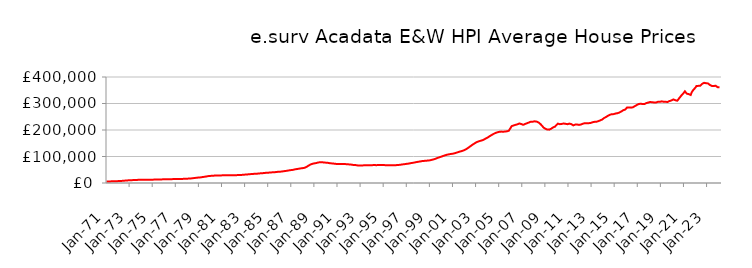
| Category | Series 0 |
|---|---|
| 1971-01-01 | 5853.436 |
| 1971-02-01 | 5895.031 |
| 1971-03-01 | 5936.975 |
| 1971-04-01 | 5991.508 |
| 1971-05-01 | 6082.004 |
| 1971-06-01 | 6176.308 |
| 1971-07-01 | 6292.273 |
| 1971-08-01 | 6418.457 |
| 1971-09-01 | 6543.633 |
| 1971-10-01 | 6673.679 |
| 1971-11-01 | 6814.065 |
| 1971-12-01 | 6985.009 |
| 1972-01-01 | 7103.659 |
| 1972-02-01 | 7181.341 |
| 1972-03-01 | 7358.166 |
| 1972-04-01 | 7605.43 |
| 1972-05-01 | 7962.692 |
| 1972-06-01 | 8276.193 |
| 1972-07-01 | 8636.637 |
| 1972-08-01 | 8984.344 |
| 1972-09-01 | 9291.366 |
| 1972-10-01 | 9578.299 |
| 1972-11-01 | 9843.997 |
| 1972-12-01 | 10118.095 |
| 1973-01-01 | 10314.181 |
| 1973-02-01 | 10452.731 |
| 1973-03-01 | 10612.008 |
| 1973-04-01 | 10793.69 |
| 1973-05-01 | 11026.628 |
| 1973-06-01 | 11177.969 |
| 1973-07-01 | 11336.47 |
| 1973-08-01 | 11512.298 |
| 1973-09-01 | 11717.491 |
| 1973-10-01 | 11930.237 |
| 1973-11-01 | 12092.365 |
| 1973-12-01 | 12208.625 |
| 1974-01-01 | 12270.98 |
| 1974-02-01 | 12338.184 |
| 1974-03-01 | 12335.431 |
| 1974-04-01 | 12308.804 |
| 1974-05-01 | 12285.307 |
| 1974-06-01 | 12286.162 |
| 1974-07-01 | 12298.11 |
| 1974-08-01 | 12338.216 |
| 1974-09-01 | 12411.174 |
| 1974-10-01 | 12500.791 |
| 1974-11-01 | 12575.059 |
| 1974-12-01 | 12648.38 |
| 1975-01-01 | 12682.302 |
| 1975-02-01 | 12725.093 |
| 1975-03-01 | 12801.036 |
| 1975-04-01 | 12909.172 |
| 1975-05-01 | 13040.454 |
| 1975-06-01 | 13110.738 |
| 1975-07-01 | 13179.658 |
| 1975-08-01 | 13274.816 |
| 1975-09-01 | 13403.597 |
| 1975-10-01 | 13546.676 |
| 1975-11-01 | 13672.653 |
| 1975-12-01 | 13807.382 |
| 1976-01-01 | 13902.24 |
| 1976-02-01 | 13991.571 |
| 1976-03-01 | 14052.695 |
| 1976-04-01 | 14117.71 |
| 1976-05-01 | 14202.771 |
| 1976-06-01 | 14258.424 |
| 1976-07-01 | 14319.985 |
| 1976-08-01 | 14411.092 |
| 1976-09-01 | 14541.477 |
| 1976-10-01 | 14688.422 |
| 1976-11-01 | 14806.001 |
| 1976-12-01 | 14911.001 |
| 1977-01-01 | 14969.384 |
| 1977-02-01 | 15036.434 |
| 1977-03-01 | 15079.911 |
| 1977-04-01 | 15130.906 |
| 1977-05-01 | 15209.671 |
| 1977-06-01 | 15281.094 |
| 1977-07-01 | 15368.912 |
| 1977-08-01 | 15489.355 |
| 1977-09-01 | 15636.651 |
| 1977-10-01 | 15802.58 |
| 1977-11-01 | 15978.12 |
| 1977-12-01 | 16207.246 |
| 1978-01-01 | 16377.397 |
| 1978-02-01 | 16510.197 |
| 1978-03-01 | 16689.159 |
| 1978-04-01 | 16929.906 |
| 1978-05-01 | 17315.852 |
| 1978-06-01 | 17706.408 |
| 1978-07-01 | 18178.766 |
| 1978-08-01 | 18663.278 |
| 1978-09-01 | 19129.575 |
| 1978-10-01 | 19593.243 |
| 1978-11-01 | 20025.608 |
| 1978-12-01 | 20452.811 |
| 1979-01-01 | 20706.935 |
| 1979-02-01 | 20877.381 |
| 1979-03-01 | 21301.955 |
| 1979-04-01 | 21883.938 |
| 1979-05-01 | 22626.635 |
| 1979-06-01 | 23097.945 |
| 1979-07-01 | 23587.133 |
| 1979-08-01 | 24138.002 |
| 1979-09-01 | 24797.971 |
| 1979-10-01 | 25502.455 |
| 1979-11-01 | 26089.013 |
| 1979-12-01 | 26544.775 |
| 1980-01-01 | 26794.997 |
| 1980-02-01 | 26989.487 |
| 1980-03-01 | 27239.034 |
| 1980-04-01 | 27531.237 |
| 1980-05-01 | 27873.047 |
| 1980-06-01 | 28055.891 |
| 1980-07-01 | 28221.691 |
| 1980-08-01 | 28374.915 |
| 1980-09-01 | 28482.952 |
| 1980-10-01 | 28552.136 |
| 1980-11-01 | 28605.31 |
| 1980-12-01 | 28718.435 |
| 1981-01-01 | 28785.682 |
| 1981-02-01 | 28887.694 |
| 1981-03-01 | 28989.981 |
| 1981-04-01 | 29127.268 |
| 1981-05-01 | 29266.461 |
| 1981-06-01 | 29313.685 |
| 1981-07-01 | 29336.206 |
| 1981-08-01 | 29341.771 |
| 1981-09-01 | 29286.506 |
| 1981-10-01 | 29185.652 |
| 1981-11-01 | 29093.062 |
| 1981-12-01 | 29082.983 |
| 1982-01-01 | 29038.044 |
| 1982-02-01 | 29057.726 |
| 1982-03-01 | 29218.871 |
| 1982-04-01 | 29490.37 |
| 1982-05-01 | 29794.494 |
| 1982-06-01 | 29905.477 |
| 1982-07-01 | 29989.212 |
| 1982-08-01 | 30148.889 |
| 1982-09-01 | 30407.805 |
| 1982-10-01 | 30715.418 |
| 1982-11-01 | 31021.884 |
| 1982-12-01 | 31401.945 |
| 1983-01-01 | 31690.741 |
| 1983-02-01 | 31938.939 |
| 1983-03-01 | 32197.556 |
| 1983-04-01 | 32518.055 |
| 1983-05-01 | 32938.406 |
| 1983-06-01 | 33268.275 |
| 1983-07-01 | 33627.445 |
| 1983-08-01 | 33968.673 |
| 1983-09-01 | 34241.441 |
| 1983-10-01 | 34464.598 |
| 1983-11-01 | 34675.18 |
| 1983-12-01 | 34951.755 |
| 1984-01-01 | 35117.057 |
| 1984-02-01 | 35284.885 |
| 1984-03-01 | 35603.527 |
| 1984-04-01 | 36045.544 |
| 1984-05-01 | 36551.527 |
| 1984-06-01 | 36775.858 |
| 1984-07-01 | 36963.603 |
| 1984-08-01 | 37249.651 |
| 1984-09-01 | 37706.107 |
| 1984-10-01 | 38234.212 |
| 1984-11-01 | 38642.374 |
| 1984-12-01 | 38926.049 |
| 1985-01-01 | 39004.795 |
| 1985-02-01 | 39113.625 |
| 1985-03-01 | 39381.177 |
| 1985-04-01 | 39756.986 |
| 1985-05-01 | 40186.096 |
| 1985-06-01 | 40351.922 |
| 1985-07-01 | 40505.228 |
| 1985-08-01 | 40770.985 |
| 1985-09-01 | 41214.195 |
| 1985-10-01 | 41720.373 |
| 1985-11-01 | 42145.809 |
| 1985-12-01 | 42486.07 |
| 1986-01-01 | 42618.326 |
| 1986-02-01 | 42753.366 |
| 1986-03-01 | 43147.821 |
| 1986-04-01 | 43718.413 |
| 1986-05-01 | 44430.577 |
| 1986-06-01 | 44861.736 |
| 1986-07-01 | 45302.5 |
| 1986-08-01 | 45828.669 |
| 1986-09-01 | 46489.999 |
| 1986-10-01 | 47204.193 |
| 1986-11-01 | 47852.471 |
| 1986-12-01 | 48456.903 |
| 1987-01-01 | 48807.58 |
| 1987-02-01 | 49097.942 |
| 1987-03-01 | 49727.772 |
| 1987-04-01 | 50575.776 |
| 1987-05-01 | 51589.003 |
| 1987-06-01 | 52160.728 |
| 1987-07-01 | 52707.671 |
| 1987-08-01 | 53309.593 |
| 1987-09-01 | 53962.968 |
| 1987-10-01 | 54639.331 |
| 1987-11-01 | 55273.021 |
| 1987-12-01 | 55929.402 |
| 1988-01-01 | 56241.432 |
| 1988-02-01 | 56510.544 |
| 1988-03-01 | 57451.77 |
| 1988-04-01 | 58868.244 |
| 1988-05-01 | 60999.522 |
| 1988-06-01 | 63150.157 |
| 1988-07-01 | 65682.48 |
| 1988-08-01 | 68011.909 |
| 1988-09-01 | 69805.564 |
| 1988-10-01 | 71294.816 |
| 1988-11-01 | 72492.564 |
| 1988-12-01 | 73555.984 |
| 1989-01-01 | 74111.867 |
| 1989-02-01 | 74581.813 |
| 1989-03-01 | 75379.46 |
| 1989-04-01 | 76395.013 |
| 1989-05-01 | 77470.912 |
| 1989-06-01 | 77940.993 |
| 1989-07-01 | 78261.046 |
| 1989-08-01 | 78411.096 |
| 1989-09-01 | 78281.736 |
| 1989-10-01 | 77919.751 |
| 1989-11-01 | 77438.186 |
| 1989-12-01 | 77045.683 |
| 1990-01-01 | 76692.421 |
| 1990-02-01 | 76677.925 |
| 1990-03-01 | 76151.559 |
| 1990-04-01 | 75468.388 |
| 1990-05-01 | 74669.578 |
| 1990-06-01 | 74288.399 |
| 1990-07-01 | 73963.585 |
| 1990-08-01 | 73646.982 |
| 1990-09-01 | 73202.082 |
| 1990-10-01 | 72693.558 |
| 1990-11-01 | 72221.602 |
| 1990-12-01 | 72021.119 |
| 1991-01-01 | 71880.186 |
| 1991-02-01 | 71955.707 |
| 1991-03-01 | 71841.309 |
| 1991-04-01 | 71765.739 |
| 1991-05-01 | 71666.273 |
| 1991-06-01 | 71621.76 |
| 1991-07-01 | 71574.462 |
| 1991-08-01 | 71508.11 |
| 1991-09-01 | 71394.539 |
| 1991-10-01 | 71191.381 |
| 1991-11-01 | 70858.624 |
| 1991-12-01 | 70506.688 |
| 1992-01-01 | 70158.125 |
| 1992-02-01 | 70104.673 |
| 1992-03-01 | 69615.741 |
| 1992-04-01 | 69025.587 |
| 1992-05-01 | 68374.133 |
| 1992-06-01 | 68160.886 |
| 1992-07-01 | 68007.563 |
| 1992-08-01 | 67685.786 |
| 1992-09-01 | 66998.998 |
| 1992-10-01 | 66146.836 |
| 1992-11-01 | 65569.169 |
| 1992-12-01 | 65585.984 |
| 1993-01-01 | 65748.247 |
| 1993-02-01 | 66035.391 |
| 1993-03-01 | 66293.403 |
| 1993-04-01 | 66616.18 |
| 1993-05-01 | 66891.369 |
| 1993-06-01 | 66922.848 |
| 1993-07-01 | 66942.759 |
| 1993-08-01 | 66997.878 |
| 1993-09-01 | 66955.948 |
| 1993-10-01 | 66835.303 |
| 1993-11-01 | 66756.355 |
| 1993-12-01 | 66990.052 |
| 1994-01-01 | 67311.536 |
| 1994-02-01 | 67712.307 |
| 1994-03-01 | 67697.03 |
| 1994-04-01 | 67533.624 |
| 1994-05-01 | 67390.12 |
| 1994-06-01 | 67402.982 |
| 1994-07-01 | 67483.973 |
| 1994-08-01 | 67650.551 |
| 1994-09-01 | 67915.323 |
| 1994-10-01 | 68236.094 |
| 1994-11-01 | 68387.906 |
| 1994-12-01 | 68298.345 |
| 1995-01-01 | 67797.893 |
| 1995-02-01 | 67367.093 |
| 1995-03-01 | 67205.11 |
| 1995-04-01 | 67036.325 |
| 1995-05-01 | 67064.918 |
| 1995-06-01 | 66922.64 |
| 1995-07-01 | 67068.521 |
| 1995-08-01 | 67133.315 |
| 1995-09-01 | 67171.629 |
| 1995-10-01 | 67147.551 |
| 1995-11-01 | 67232.22 |
| 1995-12-01 | 67314.701 |
| 1996-01-01 | 67339.12 |
| 1996-02-01 | 67298.148 |
| 1996-03-01 | 67520.514 |
| 1996-04-01 | 67782.934 |
| 1996-05-01 | 68281.505 |
| 1996-06-01 | 68646.477 |
| 1996-07-01 | 69242.481 |
| 1996-08-01 | 69819.15 |
| 1996-09-01 | 70401.777 |
| 1996-10-01 | 70826.005 |
| 1996-11-01 | 71275.79 |
| 1996-12-01 | 71911.805 |
| 1997-01-01 | 72368.006 |
| 1997-02-01 | 72854.01 |
| 1997-03-01 | 73269.099 |
| 1997-04-01 | 73942.764 |
| 1997-05-01 | 74822.704 |
| 1997-06-01 | 75490.879 |
| 1997-07-01 | 75962.601 |
| 1997-08-01 | 76714.525 |
| 1997-09-01 | 77387.268 |
| 1997-10-01 | 78258.613 |
| 1997-11-01 | 78867.902 |
| 1997-12-01 | 79641.704 |
| 1998-01-01 | 80100.782 |
| 1998-02-01 | 80790.184 |
| 1998-03-01 | 81391.552 |
| 1998-04-01 | 82138.146 |
| 1998-05-01 | 82668.5 |
| 1998-06-01 | 82994.32 |
| 1998-07-01 | 83384.475 |
| 1998-08-01 | 83749.543 |
| 1998-09-01 | 84119.064 |
| 1998-10-01 | 84364.251 |
| 1998-11-01 | 84650.311 |
| 1998-12-01 | 84994.214 |
| 1999-01-01 | 85503.232 |
| 1999-02-01 | 86519.835 |
| 1999-03-01 | 87415.99 |
| 1999-04-01 | 88305.006 |
| 1999-05-01 | 89278.555 |
| 1999-06-01 | 90308.463 |
| 1999-07-01 | 91520.965 |
| 1999-08-01 | 93090.307 |
| 1999-09-01 | 94690.066 |
| 1999-10-01 | 96159.901 |
| 1999-11-01 | 97157.947 |
| 1999-12-01 | 98498.503 |
| 2000-01-01 | 99567.622 |
| 2000-02-01 | 100776.058 |
| 2000-03-01 | 102279.627 |
| 2000-04-01 | 103914.463 |
| 2000-05-01 | 104838.974 |
| 2000-06-01 | 105804.892 |
| 2000-07-01 | 106827.34 |
| 2000-08-01 | 107678.206 |
| 2000-09-01 | 108404.666 |
| 2000-10-01 | 109096.686 |
| 2000-11-01 | 109628.409 |
| 2000-12-01 | 110172.965 |
| 2001-01-01 | 110626.749 |
| 2001-02-01 | 111477.155 |
| 2001-03-01 | 112493.387 |
| 2001-04-01 | 113610.039 |
| 2001-05-01 | 114886.889 |
| 2001-06-01 | 115997.552 |
| 2001-07-01 | 117210.594 |
| 2001-08-01 | 118469.144 |
| 2001-09-01 | 119428.264 |
| 2001-10-01 | 120193.085 |
| 2001-11-01 | 121367.69 |
| 2001-12-01 | 122777.378 |
| 2002-01-01 | 124487.88 |
| 2002-02-01 | 126263.288 |
| 2002-03-01 | 128290.948 |
| 2002-04-01 | 130542.951 |
| 2002-05-01 | 132961.126 |
| 2002-06-01 | 135601.259 |
| 2002-07-01 | 138445.54 |
| 2002-08-01 | 141038.029 |
| 2002-09-01 | 143694.633 |
| 2002-10-01 | 146192.946 |
| 2002-11-01 | 148424.808 |
| 2002-12-01 | 150792.342 |
| 2003-01-01 | 152935.809 |
| 2003-02-01 | 154665.297 |
| 2003-03-01 | 156162.467 |
| 2003-04-01 | 157482.386 |
| 2003-05-01 | 158748.366 |
| 2003-06-01 | 159610.387 |
| 2003-07-01 | 160479.324 |
| 2003-08-01 | 161928.665 |
| 2003-09-01 | 163620.085 |
| 2003-10-01 | 165798.399 |
| 2003-11-01 | 167670.856 |
| 2003-12-01 | 169612.677 |
| 2004-01-01 | 171526.849 |
| 2004-02-01 | 173927.847 |
| 2004-03-01 | 176226.898 |
| 2004-04-01 | 178308.166 |
| 2004-05-01 | 180629.742 |
| 2004-06-01 | 182756.177 |
| 2004-07-01 | 184899.192 |
| 2004-08-01 | 186961.93 |
| 2004-09-01 | 188567.733 |
| 2004-10-01 | 190269.589 |
| 2004-11-01 | 191118.126 |
| 2004-12-01 | 192143.606 |
| 2005-01-01 | 192890.198 |
| 2005-02-01 | 194062.31 |
| 2005-03-01 | 193963.667 |
| 2005-04-01 | 194002.62 |
| 2005-05-01 | 193452.272 |
| 2005-06-01 | 194018.225 |
| 2005-07-01 | 194071.909 |
| 2005-08-01 | 194408.873 |
| 2005-09-01 | 195011.417 |
| 2005-10-01 | 196181.058 |
| 2005-11-01 | 197023.625 |
| 2005-12-01 | 202962.896 |
| 2006-01-01 | 208412.312 |
| 2006-02-01 | 214499.109 |
| 2006-03-01 | 215515.616 |
| 2006-04-01 | 217191.313 |
| 2006-05-01 | 218233.419 |
| 2006-06-01 | 219510.815 |
| 2006-07-01 | 219914.259 |
| 2006-08-01 | 221414.125 |
| 2006-09-01 | 223135.031 |
| 2006-10-01 | 224622.122 |
| 2006-11-01 | 225033.928 |
| 2006-12-01 | 222513.459 |
| 2007-01-01 | 220589.243 |
| 2007-02-01 | 219585.779 |
| 2007-03-01 | 220992.009 |
| 2007-04-01 | 222808.972 |
| 2007-05-01 | 223946.863 |
| 2007-06-01 | 225752.01 |
| 2007-07-01 | 226550.853 |
| 2007-08-01 | 228414.553 |
| 2007-09-01 | 230104.064 |
| 2007-10-01 | 231450.555 |
| 2007-11-01 | 231179.876 |
| 2007-12-01 | 231433.737 |
| 2008-01-01 | 231862.829 |
| 2008-02-01 | 232777.92 |
| 2008-03-01 | 232177.934 |
| 2008-04-01 | 231593.431 |
| 2008-05-01 | 230034.299 |
| 2008-06-01 | 228228.769 |
| 2008-07-01 | 225035.701 |
| 2008-08-01 | 222117.145 |
| 2008-09-01 | 218352.898 |
| 2008-10-01 | 214227.176 |
| 2008-11-01 | 209529.519 |
| 2008-12-01 | 206241.589 |
| 2009-01-01 | 204766.945 |
| 2009-02-01 | 203425.693 |
| 2009-03-01 | 201733.2 |
| 2009-04-01 | 200864.309 |
| 2009-05-01 | 201377.137 |
| 2009-06-01 | 202903.735 |
| 2009-07-01 | 204635.206 |
| 2009-08-01 | 206997.509 |
| 2009-09-01 | 209709.561 |
| 2009-10-01 | 212208.729 |
| 2009-11-01 | 212654.967 |
| 2009-12-01 | 217045.418 |
| 2010-01-01 | 220328.658 |
| 2010-02-01 | 224087.725 |
| 2010-03-01 | 222679.125 |
| 2010-04-01 | 221932.015 |
| 2010-05-01 | 222126.787 |
| 2010-06-01 | 222964.404 |
| 2010-07-01 | 223710.277 |
| 2010-08-01 | 224451.864 |
| 2010-09-01 | 224267.605 |
| 2010-10-01 | 223377.258 |
| 2010-11-01 | 221777.534 |
| 2010-12-01 | 221917.443 |
| 2011-01-01 | 222405.556 |
| 2011-02-01 | 224135.395 |
| 2011-03-01 | 224406.84 |
| 2011-04-01 | 222135.13 |
| 2011-05-01 | 219190.106 |
| 2011-06-01 | 217499.799 |
| 2011-07-01 | 218744.114 |
| 2011-08-01 | 220368.131 |
| 2011-09-01 | 220347.569 |
| 2011-10-01 | 220616.325 |
| 2011-11-01 | 219194.902 |
| 2011-12-01 | 219267.503 |
| 2012-01-01 | 219928.388 |
| 2012-02-01 | 220752.034 |
| 2012-03-01 | 222758.722 |
| 2012-04-01 | 223673.701 |
| 2012-05-01 | 225950.013 |
| 2012-06-01 | 225872.597 |
| 2012-07-01 | 225713.292 |
| 2012-08-01 | 225190.084 |
| 2012-09-01 | 225387.307 |
| 2012-10-01 | 225721.554 |
| 2012-11-01 | 225691.958 |
| 2012-12-01 | 226421.94 |
| 2013-01-01 | 227195.554 |
| 2013-02-01 | 229210.693 |
| 2013-03-01 | 230129.429 |
| 2013-04-01 | 230712.482 |
| 2013-05-01 | 230551.196 |
| 2013-06-01 | 230839.454 |
| 2013-07-01 | 231821.538 |
| 2013-08-01 | 233326.744 |
| 2013-09-01 | 234754.498 |
| 2013-10-01 | 236190.006 |
| 2013-11-01 | 237160.886 |
| 2013-12-01 | 239469.325 |
| 2014-01-01 | 242790.006 |
| 2014-02-01 | 245119.876 |
| 2014-03-01 | 247593.436 |
| 2014-04-01 | 248854.276 |
| 2014-05-01 | 251463.816 |
| 2014-06-01 | 253556.466 |
| 2014-07-01 | 255388.278 |
| 2014-08-01 | 257365.594 |
| 2014-09-01 | 258696.486 |
| 2014-10-01 | 259600.018 |
| 2014-11-01 | 259488.657 |
| 2014-12-01 | 259918.568 |
| 2015-01-01 | 261151.596 |
| 2015-02-01 | 262220.948 |
| 2015-03-01 | 262799.109 |
| 2015-04-01 | 263395.723 |
| 2015-05-01 | 264658.741 |
| 2015-06-01 | 266105.081 |
| 2015-07-01 | 267443.177 |
| 2015-08-01 | 270016.474 |
| 2015-09-01 | 271965.795 |
| 2015-10-01 | 274709.304 |
| 2015-11-01 | 275043.634 |
| 2015-12-01 | 277179.644 |
| 2016-01-01 | 279397.321 |
| 2016-02-01 | 285318.802 |
| 2016-03-01 | 285545.05 |
| 2016-04-01 | 285335.827 |
| 2016-05-01 | 283266.747 |
| 2016-06-01 | 284335.022 |
| 2016-07-01 | 284847.537 |
| 2016-08-01 | 285777.451 |
| 2016-09-01 | 287399.926 |
| 2016-10-01 | 290135.43 |
| 2016-11-01 | 291897.326 |
| 2016-12-01 | 294178.57 |
| 2017-01-01 | 296358.26 |
| 2017-02-01 | 297973.477 |
| 2017-03-01 | 299497.204 |
| 2017-04-01 | 299277.407 |
| 2017-05-01 | 299125.157 |
| 2017-06-01 | 297854.706 |
| 2017-07-01 | 297778.805 |
| 2017-08-01 | 298202.844 |
| 2017-09-01 | 300117.918 |
| 2017-10-01 | 301592.834 |
| 2017-11-01 | 302886.164 |
| 2017-12-01 | 303638.316 |
| 2018-01-01 | 304960.335 |
| 2018-02-01 | 305858.143 |
| 2018-03-01 | 305226.8 |
| 2018-04-01 | 304546.433 |
| 2018-05-01 | 303728.051 |
| 2018-06-01 | 304057.852 |
| 2018-07-01 | 302880.725 |
| 2018-08-01 | 303633.96 |
| 2018-09-01 | 304466.67 |
| 2018-10-01 | 306560.144 |
| 2018-11-01 | 305650.282 |
| 2018-12-01 | 306235.918 |
| 2019-01-01 | 306703.423 |
| 2019-02-01 | 308132.652 |
| 2019-03-01 | 307368.863 |
| 2019-04-01 | 306672.68 |
| 2019-05-01 | 306763.661 |
| 2019-06-01 | 306525.503 |
| 2019-07-01 | 305855.905 |
| 2019-08-01 | 305593.763 |
| 2019-09-01 | 307260.383 |
| 2019-10-01 | 309356.179 |
| 2019-11-01 | 310430.712 |
| 2019-12-01 | 311424.864 |
| 2020-01-01 | 312901.397 |
| 2020-02-01 | 315359.406 |
| 2020-03-01 | 315400.509 |
| 2020-04-01 | 312475.729 |
| 2020-05-01 | 309882.901 |
| 2020-06-01 | 310422.672 |
| 2020-07-01 | 314572.689 |
| 2020-08-01 | 319732.395 |
| 2020-09-01 | 323978.874 |
| 2020-10-01 | 328971.815 |
| 2020-11-01 | 331317.265 |
| 2020-12-01 | 336573.779 |
| 2021-01-01 | 339650.241 |
| 2021-02-01 | 346045.619 |
| 2021-03-01 | 341176.977 |
| 2021-04-01 | 337137.081 |
| 2021-05-01 | 339140.715 |
| 2021-06-01 | 335397.467 |
| 2021-07-01 | 336497.987 |
| 2021-08-01 | 332028.213 |
| 2021-09-01 | 341612.759 |
| 2021-10-01 | 347757.482 |
| 2021-11-01 | 349811.115 |
| 2021-12-01 | 356319.545 |
| 2022-01-01 | 360289.17 |
| 2022-02-01 | 365931.605 |
| 2022-03-01 | 366156.516 |
| 2022-04-01 | 366513.212 |
| 2022-05-01 | 365893.351 |
| 2022-06-01 | 367071.773 |
| 2022-07-01 | 369983.42 |
| 2022-08-01 | 374211.412 |
| 2022-09-01 | 377015.776 |
| 2022-10-01 | 378074.491 |
| 2022-11-01 | 376626.016 |
| 2022-12-01 | 376563.088 |
| 2023-01-01 | 376290.805 |
| 2023-02-01 | 375740.812 |
| 2023-03-01 | 373080.285 |
| 2023-04-01 | 369834.635 |
| 2023-05-01 | 367922.171 |
| 2023-06-01 | 366065.173 |
| 2023-07-01 | 365537.425 |
| 2023-08-01 | 366021.83 |
| 2023-09-01 | 367039.49 |
| 2023-10-01 | 367041.51 |
| 2023-11-01 | 363576.015 |
| 2023-12-01 | 361346.415 |
| 2024-01-01 | 359701.947 |
| 2024-02-01 | 361151.885 |
| 2024-03-01 | 361367.553 |